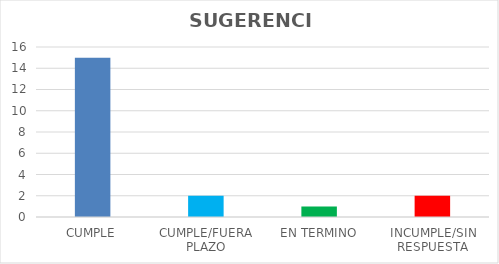
| Category | TOTAL |
|---|---|
| CUMPLE | 15 |
| CUMPLE/FUERA PLAZO | 2 |
| EN TERMINO | 1 |
| INCUMPLE/SIN RESPUESTA | 2 |